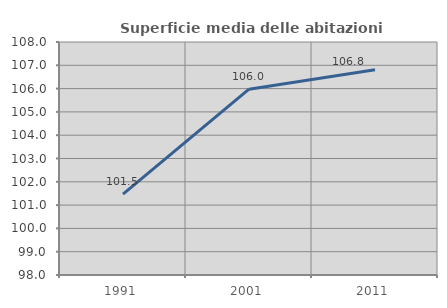
| Category | Superficie media delle abitazioni occupate |
|---|---|
| 1991.0 | 101.474 |
| 2001.0 | 105.974 |
| 2011.0 | 106.805 |